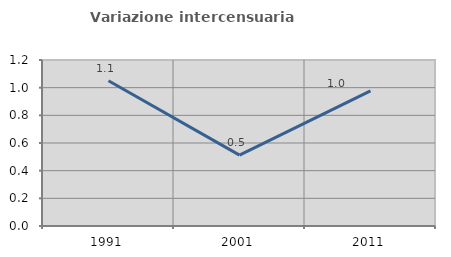
| Category | Variazione intercensuaria annua |
|---|---|
| 1991.0 | 1.05 |
| 2001.0 | 0.512 |
| 2011.0 | 0.977 |